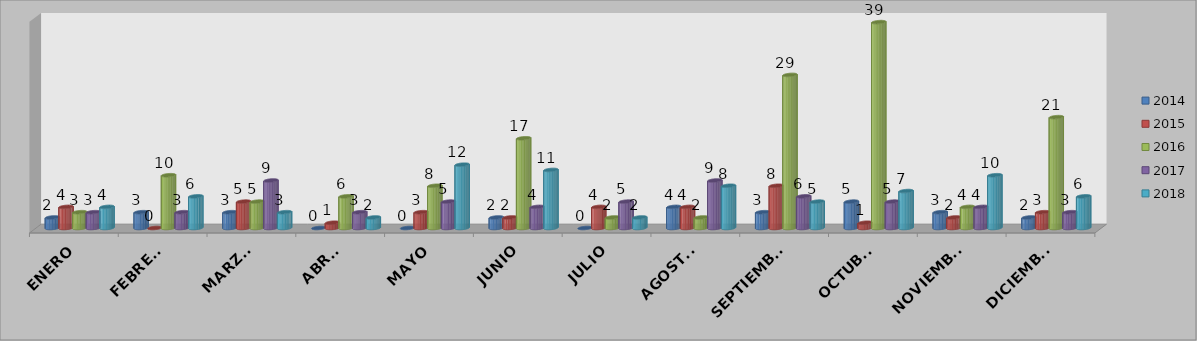
| Category | 2014 | 2015 | 2016 | 2017 | 2018 |
|---|---|---|---|---|---|
| ENERO | 2 | 4 | 3 | 3 | 4 |
| FEBRERO | 3 | 0 | 10 | 3 | 6 |
| MARZO  | 3 | 5 | 5 | 9 | 3 |
| ABRIL | 0 | 1 | 6 | 3 | 2 |
| MAYO | 0 | 3 | 8 | 5 | 12 |
| JUNIO | 2 | 2 | 17 | 4 | 11 |
| JULIO | 0 | 4 | 2 | 5 | 2 |
| AGOSTO | 4 | 4 | 2 | 9 | 8 |
| SEPTIEMBRE | 3 | 8 | 29 | 6 | 5 |
| OCTUBRE | 5 | 1 | 39 | 5 | 7 |
| NOVIEMBRE | 3 | 2 | 4 | 4 | 10 |
| DICIEMBRE | 2 | 3 | 21 | 3 | 6 |